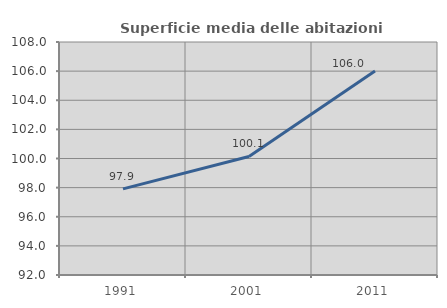
| Category | Superficie media delle abitazioni occupate |
|---|---|
| 1991.0 | 97.917 |
| 2001.0 | 100.14 |
| 2011.0 | 106.007 |